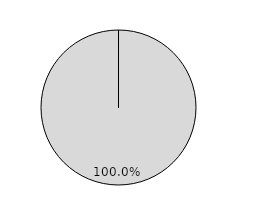
| Category |   |
|---|---|
| No response | 35 |
| No | 0 |
| Partly | 0 |
| Yes | 0 |